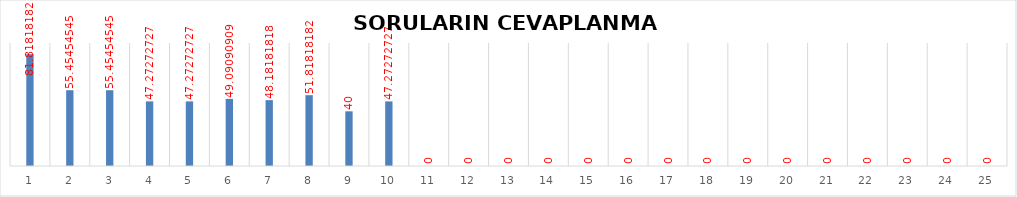
| Category | Series 0 |
|---|---|
| 0 | 81.818 |
| 1 | 55.455 |
| 2 | 55.455 |
| 3 | 47.273 |
| 4 | 47.273 |
| 5 | 49.091 |
| 6 | 48.182 |
| 7 | 51.818 |
| 8 | 40 |
| 9 | 47.273 |
| 10 | 0 |
| 11 | 0 |
| 12 | 0 |
| 13 | 0 |
| 14 | 0 |
| 15 | 0 |
| 16 | 0 |
| 17 | 0 |
| 18 | 0 |
| 19 | 0 |
| 20 | 0 |
| 21 | 0 |
| 22 | 0 |
| 23 | 0 |
| 24 | 0 |